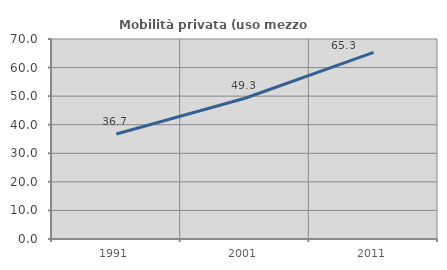
| Category | Mobilità privata (uso mezzo privato) |
|---|---|
| 1991.0 | 36.747 |
| 2001.0 | 49.273 |
| 2011.0 | 65.298 |